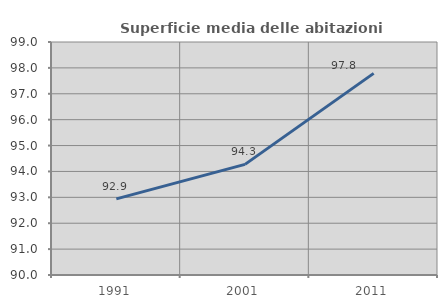
| Category | Superficie media delle abitazioni occupate |
|---|---|
| 1991.0 | 92.939 |
| 2001.0 | 94.274 |
| 2011.0 | 97.789 |